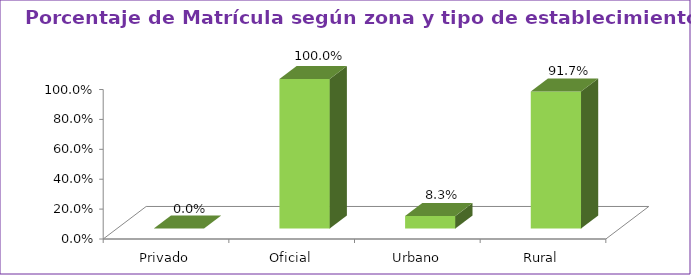
| Category | Series 1 |
|---|---|
| Privado | 0 |
| Oficial | 1 |
| Urbano | 0.083 |
| Rural | 0.917 |